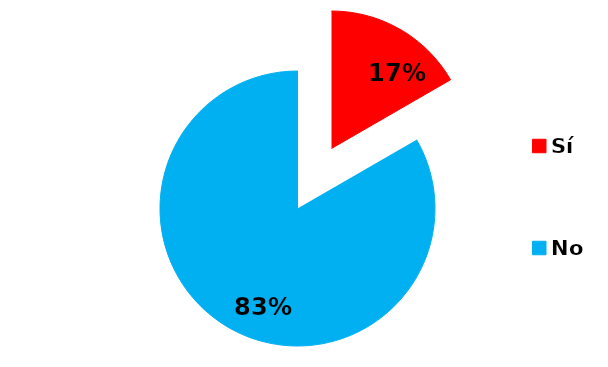
| Category | Series 0 |
|---|---|
| Sí | 3 |
| No | 15 |